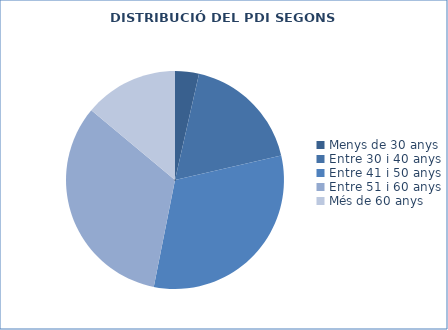
| Category | Series 0 |
|---|---|
| Menys de 30 anys | 94 |
| Entre 30 i 40 anys | 474 |
| Entre 41 i 50 anys | 843 |
| Entre 51 i 60 anys | 875 |
| Més de 60 anys | 370 |